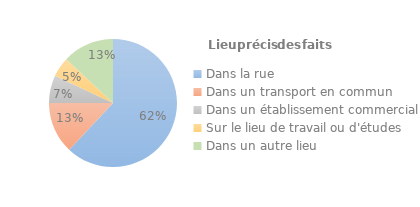
| Category | Series 0 |
|---|---|
| Dans la rue | 0.62 |
| Dans un transport en commun | 0.13 |
| Dans un établissement commercial | 0.07 |
| Sur le lieu de travail ou d'études  | 0.05 |
| Dans un autre lieu | 0.13 |